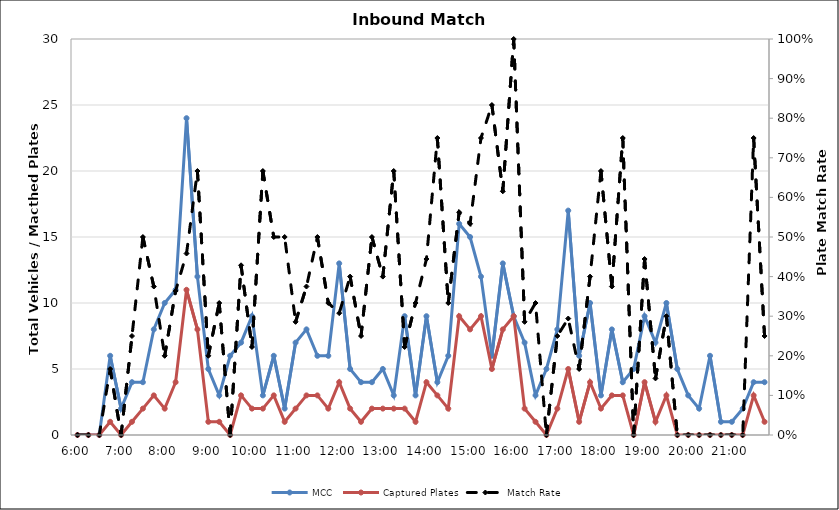
| Category | MCC | Captured Plates |
|---|---|---|
| 0.25 | 0 | 0 |
| 0.260416666666667 | 0 | 0 |
| 0.270833333333333 | 0 | 0 |
| 0.28125 | 6 | 1 |
| 0.291666666666667 | 2 | 0 |
| 0.302083333333333 | 4 | 1 |
| 0.3125 | 4 | 2 |
| 0.322916666666667 | 8 | 3 |
| 0.333333333333333 | 10 | 2 |
| 0.34375 | 11 | 4 |
| 0.354166666666667 | 24 | 11 |
| 0.364583333333333 | 12 | 8 |
| 0.375 | 5 | 1 |
| 0.385416666666667 | 3 | 1 |
| 0.395833333333333 | 6 | 0 |
| 0.40625 | 7 | 3 |
| 0.416666666666667 | 9 | 2 |
| 0.427083333333333 | 3 | 2 |
| 0.4375 | 6 | 3 |
| 0.447916666666667 | 2 | 1 |
| 0.458333333333333 | 7 | 2 |
| 0.46875 | 8 | 3 |
| 0.479166666666667 | 6 | 3 |
| 0.489583333333333 | 6 | 2 |
| 0.5 | 13 | 4 |
| 0.510416666666667 | 5 | 2 |
| 0.520833333333333 | 4 | 1 |
| 0.53125 | 4 | 2 |
| 0.541666666666667 | 5 | 2 |
| 0.552083333333333 | 3 | 2 |
| 0.5625 | 9 | 2 |
| 0.572916666666667 | 3 | 1 |
| 0.583333333333333 | 9 | 4 |
| 0.59375 | 4 | 3 |
| 0.604166666666667 | 6 | 2 |
| 0.614583333333333 | 16 | 9 |
| 0.625 | 15 | 8 |
| 0.635416666666667 | 12 | 9 |
| 0.645833333333333 | 6 | 5 |
| 0.65625 | 13 | 8 |
| 0.666666666666667 | 9 | 9 |
| 0.677083333333333 | 7 | 2 |
| 0.6875 | 3 | 1 |
| 0.697916666666667 | 5 | 0 |
| 0.708333333333333 | 8 | 2 |
| 0.71875 | 17 | 5 |
| 0.729166666666667 | 6 | 1 |
| 0.739583333333333 | 10 | 4 |
| 0.75 | 3 | 2 |
| 0.760416666666667 | 8 | 3 |
| 0.770833333333333 | 4 | 3 |
| 0.78125 | 5 | 0 |
| 0.791666666666667 | 9 | 4 |
| 0.802083333333333 | 7 | 1 |
| 0.8125 | 10 | 3 |
| 0.822916666666667 | 5 | 0 |
| 0.833333333333333 | 3 | 0 |
| 0.84375 | 2 | 0 |
| 0.854166666666667 | 6 | 0 |
| 0.864583333333333 | 1 | 0 |
| 0.875 | 1 | 0 |
| 0.885416666666667 | 2 | 0 |
| 0.895833333333333 | 4 | 3 |
| 0.90625 | 4 | 1 |